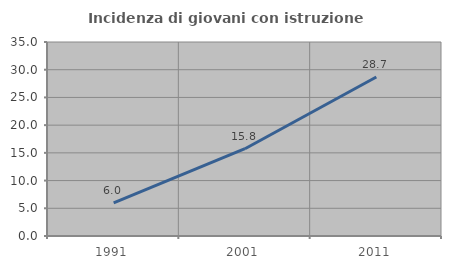
| Category | Incidenza di giovani con istruzione universitaria |
|---|---|
| 1991.0 | 5.973 |
| 2001.0 | 15.751 |
| 2011.0 | 28.679 |